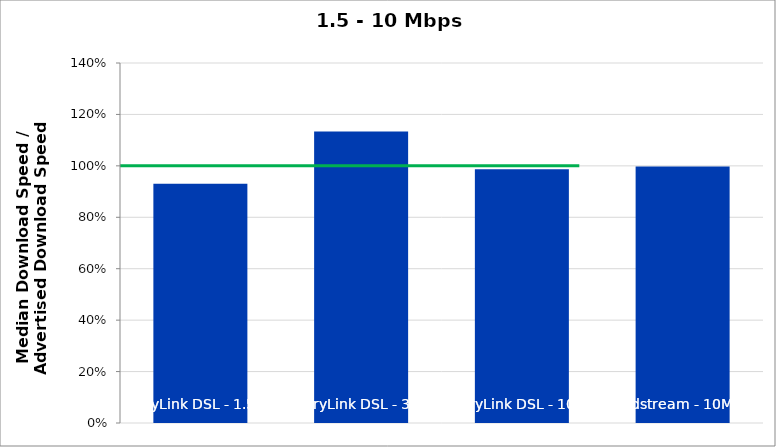
| Category | foo |
|---|---|
| CenturyLink DSL - 1.5Mbps | 0.931 |
| CenturyLink DSL - 3Mbps | 1.134 |
| CenturyLink DSL - 10Mbps | 0.987 |
| Windstream - 10Mbps | 0.997 |